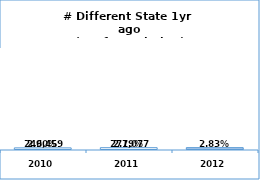
| Category | Chosen | Unchosen | Blank |
|---|---|---|---|
| 2010.0 | 0 | 249459 | 9337778 |
| 2011.0 | 0 | 271077 | 9428782 |
| 2012.0 | 277466 | 0 | 9519081 |